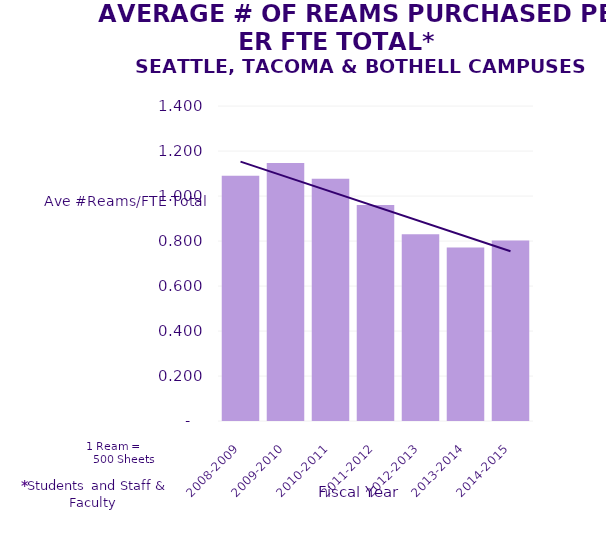
| Category | Series 1 |
|---|---|
| 2008-2009 | 1.089 |
| 2009-2010 | 1.146 |
| 2010-2011 | 1.077 |
| 2011-2012 | 0.96 |
| 2012-2013 | 0.83 |
| 2013-2014 | 0.771 |
| 2014-2015 | 0.802 |